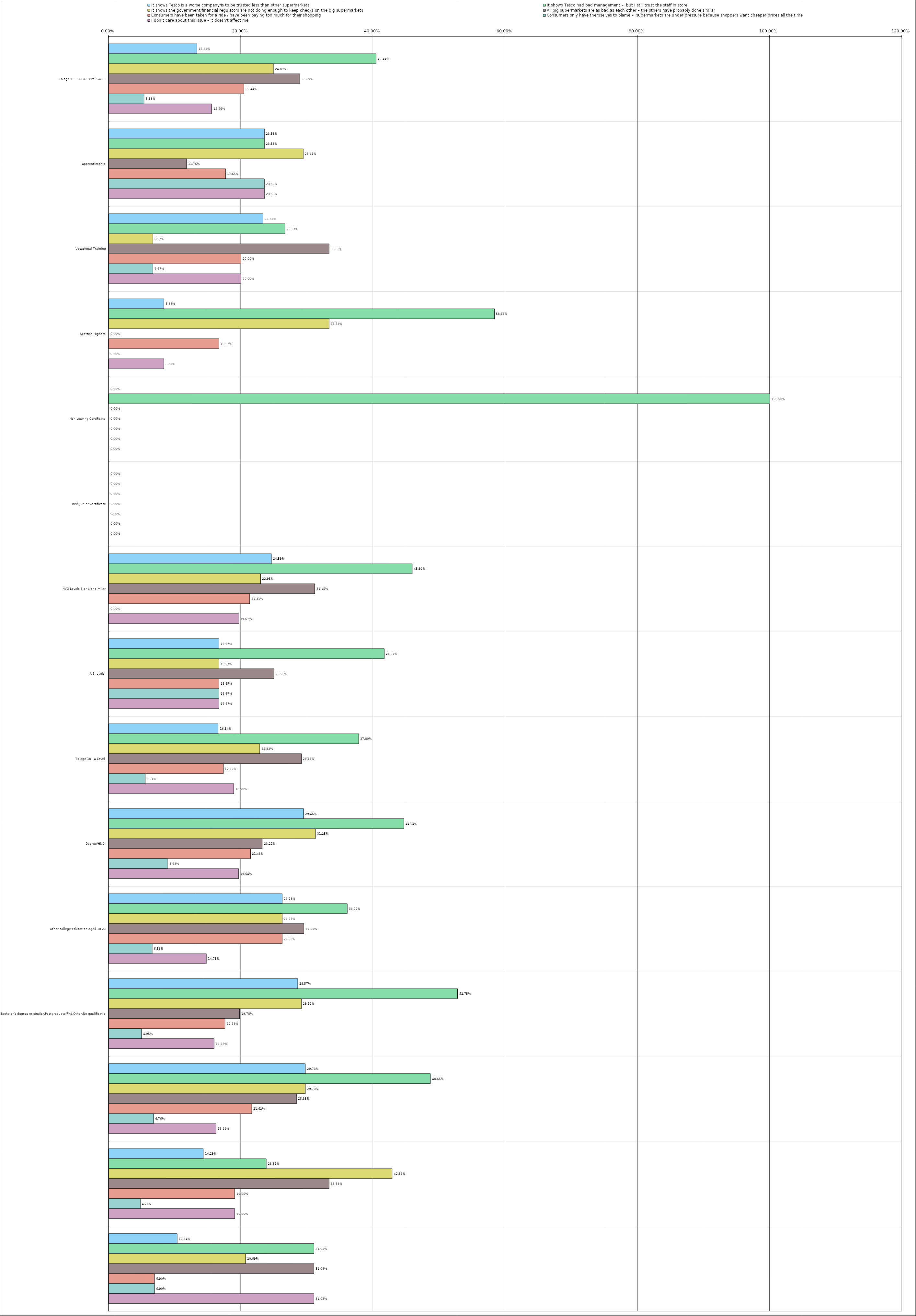
| Category | It shows Tesco is a worse company/is to be trusted less than other supermarkets | It shows Tesco had bad management –  but I still trust the staff in store | It shows the government/financial regulators are not doing enough to keep checks on the big supermarkets | All big supermarkets are as bad as each other – the others have probably done similar | Consumers have been taken for a ride / have been paying too much for their shopping | Consumers only have themselves to blame –  supermarkets are under pressure because shoppers want cheaper prices all the time | I don’t care about this issue – it doesn't affect me |
|---|---|---|---|---|---|---|---|
| 0 | 0.133 | 0.404 | 0.249 | 0.289 | 0.204 | 0.053 | 0.156 |
| 1 | 0.235 | 0.235 | 0.294 | 0.118 | 0.176 | 0.235 | 0.235 |
| 2 | 0.233 | 0.267 | 0.067 | 0.333 | 0.2 | 0.067 | 0.2 |
| 3 | 0.083 | 0.583 | 0.333 | 0 | 0.167 | 0 | 0.083 |
| 4 | 0 | 1 | 0 | 0 | 0 | 0 | 0 |
| 5 | 0 | 0 | 0 | 0 | 0 | 0 | 0 |
| 6 | 0.246 | 0.459 | 0.23 | 0.312 | 0.213 | 0 | 0.197 |
| 7 | 0.167 | 0.417 | 0.167 | 0.25 | 0.167 | 0.167 | 0.167 |
| 8 | 0.165 | 0.378 | 0.228 | 0.291 | 0.173 | 0.055 | 0.189 |
| 9 | 0.295 | 0.446 | 0.312 | 0.232 | 0.214 | 0.089 | 0.196 |
| 10 | 0.262 | 0.361 | 0.262 | 0.295 | 0.262 | 0.066 | 0.148 |
| 11 | 0.286 | 0.528 | 0.291 | 0.198 | 0.176 | 0.05 | 0.159 |
| 12 | 0.297 | 0.486 | 0.297 | 0.284 | 0.216 | 0.068 | 0.162 |
| 13 | 0.143 | 0.238 | 0.429 | 0.333 | 0.19 | 0.048 | 0.19 |
| 14 | 0.103 | 0.31 | 0.207 | 0.31 | 0.069 | 0.069 | 0.31 |